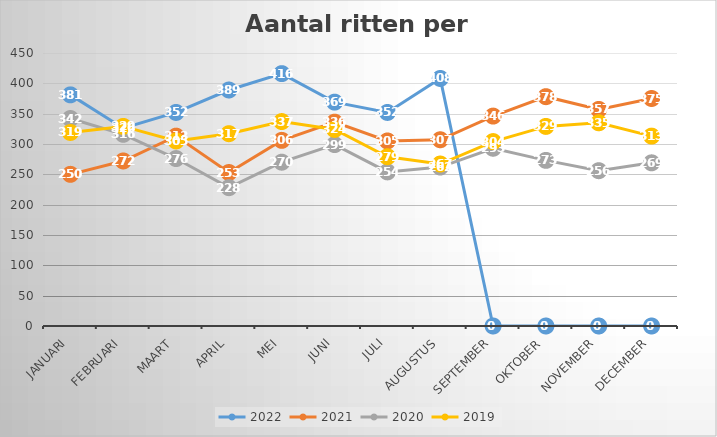
| Category | 2022 | 2021 | 2020 | 2019 |
|---|---|---|---|---|
| januari | 381 | 250 | 342 | 319 |
| februari | 326 | 272 | 316 | 329 |
| maart | 352 | 313 | 276 | 305 |
| april | 389 | 253 | 228 | 317 |
| mei | 416 | 306 | 270 | 337 |
| juni | 369 | 336 | 299 | 324 |
| juli | 352 | 305 | 254 | 279 |
| augustus | 408 | 307 | 262 | 267 |
| september | 0 | 346 | 293 | 304 |
| oktober | 0 | 378 | 273 | 329 |
| november | 0 | 357 | 256 | 335 |
| december | 0 | 375 | 269 | 313 |